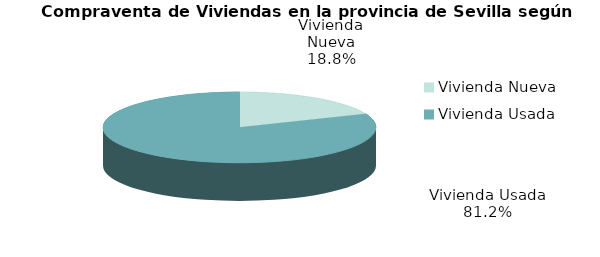
| Category | Series 0 | Series 1 |
|---|---|---|
| Vivienda Nueva | 309 | 0.188 |
| Vivienda Usada | 1338 | 0.812 |